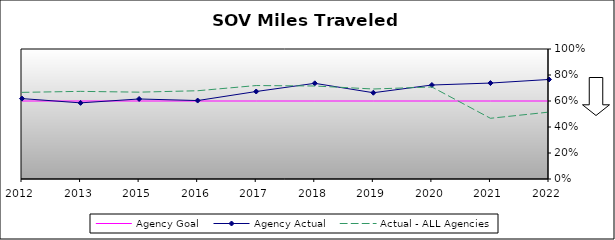
| Category | Agency Goal | Agency Actual | Actual - ALL Agencies |
|---|---|---|---|
| 2012.0 | 0.6 | 0.619 | 0.666 |
| 2013.0 | 0.6 | 0.586 | 0.674 |
| 2015.0 | 0.6 | 0.616 | 0.668 |
| 2016.0 | 0.6 | 0.603 | 0.679 |
| 2017.0 | 0.6 | 0.673 | 0.719 |
| 2018.0 | 0.6 | 0.736 | 0.715 |
| 2019.0 | 0.6 | 0.664 | 0.692 |
| 2020.0 | 0.6 | 0.723 | 0.708 |
| 2021.0 | 0.6 | 0.738 | 0.467 |
| 2022.0 | 0.6 | 0.766 | 0.515 |